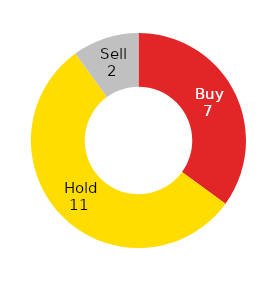
| Category | Series 0 |
|---|---|
| Buy | 7 |
| Hold | 11 |
| Sell | 2 |